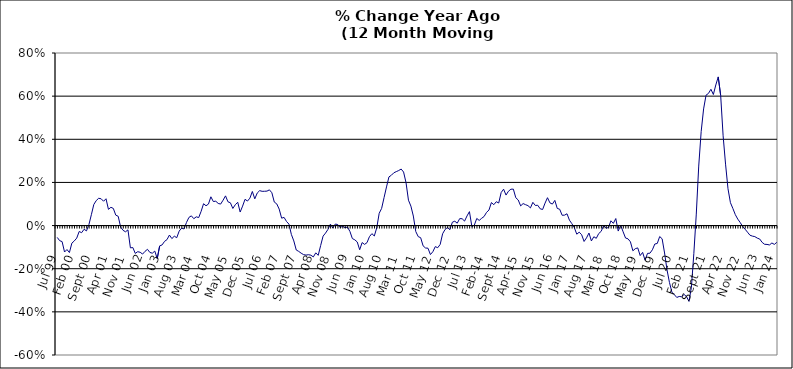
| Category | Series 0 |
|---|---|
| Jul 99 | -0.055 |
| Aug 99 | -0.07 |
| Sep 99 | -0.074 |
| Oct 99 | -0.123 |
| Nov 99 | -0.111 |
| Dec 99 | -0.125 |
| Jan 00 | -0.082 |
| Feb 00 | -0.071 |
| Mar 00 | -0.058 |
| Apr 00 | -0.027 |
| May 00 | -0.033 |
| Jun 00 | -0.017 |
| Jul 00 | -0.025 |
| Aug 00 | 0.005 |
| Sep 00 | 0.05 |
| Oct 00 | 0.098 |
| Nov 00 | 0.116 |
| Dec 00 | 0.127 |
| Jan 01 | 0.124 |
| Feb 01 | 0.113 |
| Mar 01 | 0.124 |
| Apr 01 | 0.075 |
| May 01 | 0.085 |
| Jun 01 | 0.08 |
| Jul 01 | 0.048 |
| Aug 01 | 0.043 |
| Sep 01 | -0.007 |
| Oct 01 | -0.022 |
| Nov 01 | -0.029 |
| Dec 01 | -0.02 |
| Jan 02 | -0.103 |
| Feb 02 | -0.102 |
| Mar 02 | -0.129 |
| Apr 02 | -0.121 |
| May 02 | -0.124 |
| Jun 02 | -0.132 |
| Jul 02 | -0.119 |
| Aug 02 | -0.11 |
| Sep 02 | -0.125 |
| Oct 02 | -0.128 |
| Nov 02 | -0.118 |
| Dec 02 | -0.153 |
| Jan 03 | -0.094 |
| Feb 03 | -0.09 |
| Mar 03 | -0.073 |
| Apr 03 | -0.065 |
| May 03 | -0.044 |
| Jun 03 | -0.06 |
| Jul 03 | -0.049 |
| Aug 03 | -0.056 |
| Sep 03 | -0.026 |
| Oct 03 | -0.012 |
| Nov 03 | -0.016 |
| Dec 03 | 0.014 |
| Jan 04 | 0.038 |
| Feb 04 | 0.045 |
| Mar 04 | 0.032 |
| Apr 04 | 0.041 |
| May 04 | 0.037 |
| Jun 04 | 0.066 |
| Jul 04 | 0.101 |
| Aug 04 | 0.092 |
| Sep 04 | 0.1 |
| Oct 04 | 0.133 |
| Nov 04 | 0.111 |
| Dec 04 | 0.113 |
| Jan 05 | 0.103 |
| Feb 05 | 0.1 |
| Mar 05 | 0.118 |
| Apr 05 | 0.138 |
| May 05 | 0.11 |
| Jun 05 | 0.106 |
| Jul 05 | 0.079 |
| Aug 05 | 0.097 |
| Sep 05 | 0.108 |
| Oct 05 | 0.063 |
| Nov 05 | 0.09 |
| Dec 05 | 0.122 |
| Jan 06 | 0.114 |
| Feb 06 | 0.127 |
| Mar 06 | 0.158 |
| Apr 06 | 0.124 |
| May 06 | 0.151 |
| Jun 06 | 0.162 |
| Jul 06 | 0.159 |
| Aug 06 | 0.159 |
| Sep 06 | 0.16 |
| Oct 06 | 0.166 |
| Nov 06 | 0.152 |
| Dec 06 | 0.109 |
| Jan 07 | 0.101 |
| Feb 07 | 0.076 |
| Mar 07 | 0.034 |
| Apr 07 | 0.038 |
| May 07 | 0.019 |
| Jun 07 | 0.007 |
| Jul 07 | -0.041 |
| Aug 07 | -0.071 |
| Sep 07 | -0.113 |
| Oct 07 | -0.12 |
| Nov 07 | -0.128 |
| Dec 07 | -0.135 |
| Jan 08 | -0.137 |
| Feb 08 | -0.135 |
| Mar 08 | -0.137 |
| Apr 08 | -0.145 |
| May 08 | -0.126 |
| Jun 08 | -0.138 |
| Jul 08 | -0.093 |
| Aug 08 | -0.049 |
| Sep-08 | -0.035 |
| Oct 08 | -0.018 |
| Nov 08 | 0.007 |
| Dec 08 | -0.011 |
| Jan 09 | 0.007 |
| Feb 09 | 0.005 |
| Mar 09 | -0.009 |
| Apr 09 | -0.003 |
| May 09 | -0.01 |
| Jun 09 | -0.007 |
| Jul 09 | -0.027 |
| Aug 09 | -0.06 |
| Sep 09 | -0.066 |
| Oct 09 | -0.076 |
| Nov 09 | -0.112 |
| Dec 09 | -0.079 |
| Jan 10 | -0.087 |
| Feb 10 | -0.079 |
| Mar 10 | -0.052 |
| Apr 10 | -0.037 |
| May 10 | -0.048 |
| Jun 10 | -0.01 |
| Jul 10 | 0.057 |
| Aug 10 | 0.08 |
| Sep 10 | 0.13 |
| Oct 10 | 0.179 |
| Nov 10 | 0.226 |
| Dec 10 | 0.233 |
| Jan 11 | 0.245 |
| Feb 11 | 0.25 |
| Mar 11 | 0.255 |
| Apr 11 | 0.262 |
| May 11 | 0.248 |
| Jun 11 | 0.199 |
| Jul 11 | 0.118 |
| Aug 11 | 0.09 |
| Sep 11 | 0.044 |
| Oct 11 | -0.028 |
| Nov 11 | -0.051 |
| Dec 11 | -0.056 |
| Jan 12 | -0.094 |
| Feb 12 | -0.104 |
| Mar 12 | -0.105 |
| Apr 12 | -0.134 |
| May 12 | -0.121 |
| Jun 12 | -0.098 |
| Jul 12 | -0.103 |
| Aug 12 | -0.087 |
| Sep 12 | -0.038 |
| Oct 12 | -0.018 |
| Nov 12 | -0.009 |
| Dec 12 | -0.019 |
| Jan 13 | 0.016 |
| Feb-13 | 0.02 |
| Mar-13 | 0.011 |
| Apr 13 | 0.032 |
| May 13 | 0.032 |
| Jun-13 | 0.021 |
| Jul 13 | 0.045 |
| Aug 13 | 0.065 |
| Sep 13 | -0.005 |
| Oct 13 | 0.002 |
| Nov 13 | 0.033 |
| Dec 13 | 0.024 |
| Jan 14 | 0.034 |
| Feb-14 | 0.042 |
| Mar 14 | 0.061 |
| Apr 14 | 0.072 |
| May 14 | 0.107 |
| Jun 14 | 0.097 |
| Jul-14 | 0.111 |
| Aug-14 | 0.105 |
| Sep 14 | 0.153 |
| Oct 14 | 0.169 |
| Nov 14 | 0.141 |
| Dec 14 | 0.159 |
| Jan 15 | 0.169 |
| Feb 15 | 0.169 |
| Mar 15 | 0.129 |
| Apr-15 | 0.118 |
| May 15 | 0.091 |
| Jun-15 | 0.102 |
| Jul 15 | 0.097 |
| Aug 15 | 0.092 |
| Sep 15 | 0.082 |
| Oct 15 | 0.108 |
| Nov 15 | 0.093 |
| Dec 15 | 0.094 |
| Jan 16 | 0.078 |
| Feb 16 | 0.075 |
| Mar 16 | 0.104 |
| Apr 16 | 0.129 |
| May 16 | 0.105 |
| Jun 16 | 0.1 |
| Jul 16 | 0.117 |
| Aug 16 | 0.08 |
| Sep 16 | 0.076 |
| Oct 16 | 0.048 |
| Nov 16 | 0.048 |
| Dec 16 | 0.055 |
| Jan 17 | 0.025 |
| Feb 17 | 0.009 |
| Mar 17 | -0.01 |
| Apr 17 | -0.04 |
| May 17 | -0.031 |
| Jun 17 | -0.042 |
| Jul 17 | -0.074 |
| Aug 17 | -0.057 |
| Sep 17 | -0.035 |
| Oct 17 | -0.071 |
| Nov 17 | -0.052 |
| Dec 17 | -0.059 |
| Jan 18 | -0.037 |
| Feb 18 | -0.027 |
| Mar 18 | 0 |
| Apr 18 | -0.012 |
| May 18 | -0.009 |
| Jun 18 | 0.022 |
| Jul 18 | 0.01 |
| Aug 18 | 0.033 |
| Sep 18 | -0.025 |
| Oct 18 | 0.002 |
| Nov 18 | -0.029 |
| Dec 18 | -0.058 |
| Jan 19 | -0.061 |
| Feb 19 | -0.075 |
| Mar 19 | -0.117 |
| Apr 19 | -0.107 |
| May 19 | -0.104 |
| Jun 19 | -0.139 |
| Jul 19 | -0.124 |
| Aug 19 | -0.16 |
| Sep 19 | -0.129 |
| Oct 19 | -0.128 |
| Nov 19 | -0.112 |
| Dec 19 | -0.085 |
| Jan 20 | -0.083 |
| Feb 20 | -0.051 |
| Mar 20 | -0.061 |
| Apr 20 | -0.127 |
| May 20 | -0.206 |
| Jun 20 | -0.264 |
| Jul 20 | -0.308 |
| Aug 20 | -0.32 |
| Sep 20 | -0.333 |
| Oct 20 | -0.329 |
| Nov 20 | -0.33 |
| Dec 20 | -0.319 |
| Jan 21 | -0.329 |
| Feb 21 | -0.352 |
| Mar 21 | -0.286 |
| Apr 21 | -0.129 |
| May 21 | 0.053 |
| Jun 21 | 0.276 |
| Jul 21 | 0.435 |
| Aug 21 | 0.541 |
| Sep 21 | 0.604 |
| Oct 21 | 0.613 |
| Nov 21 | 0.632 |
| Dec 21 | 0.608 |
| Jan 22 | 0.652 |
| Feb 22 | 0.689 |
| Mar 22 | 0.603 |
| Apr 22 | 0.416 |
| May 22 | 0.285 |
| Jun 22 | 0.171 |
| Jul 22 | 0.106 |
| Aug 22 | 0.079 |
| Sep 22 | 0.051 |
| Oct 22 | 0.03 |
| Nov 22 | 0.014 |
| Dec 22 | -0.004 |
| Jan 23 | -0.017 |
| Feb 23 | -0.031 |
| Mar 23 | -0.045 |
| Apr 23 | -0.049 |
| May 23 | -0.051 |
| Jun 23 | -0.058 |
| Jul 23 | -0.062 |
| Aug 23 | -0.078 |
| Sep 23 | -0.087 |
| Oct 23 | -0.087 |
| Nov 23 | -0.09 |
| Dec 23 | -0.081 |
| Jan 24 | -0.087 |
| Feb 24 | -0.078 |